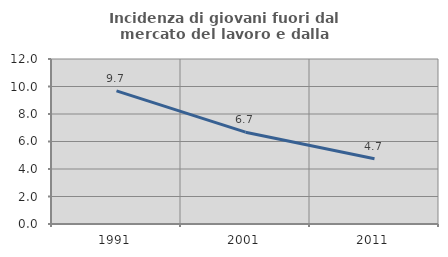
| Category | Incidenza di giovani fuori dal mercato del lavoro e dalla formazione  |
|---|---|
| 1991.0 | 9.686 |
| 2001.0 | 6.677 |
| 2011.0 | 4.744 |